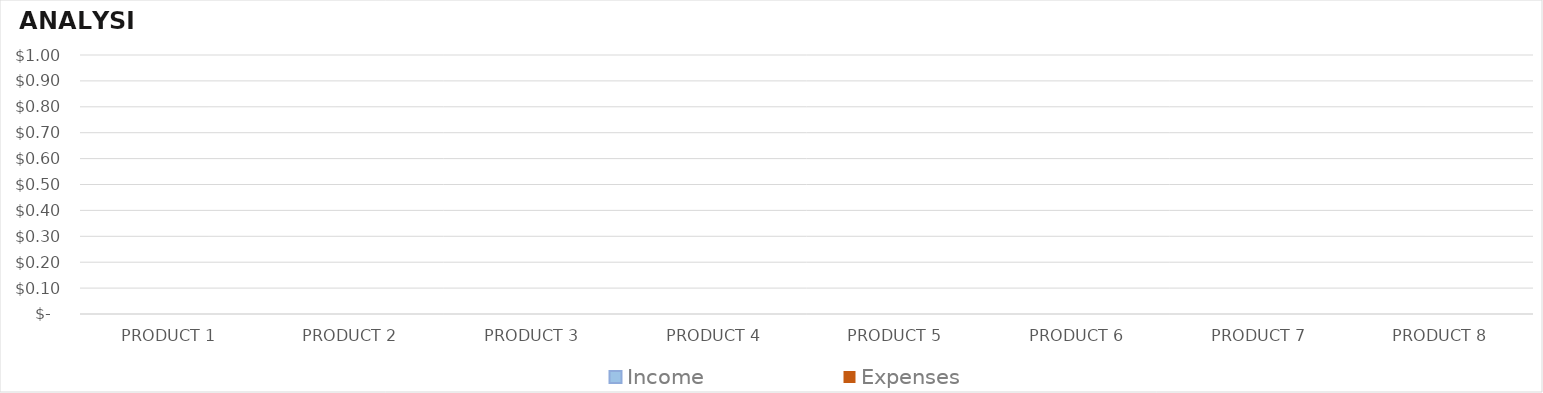
| Category | Income | Expenses |
|---|---|---|
| PRODUCT 1 | 0 | 0 |
| PRODUCT 2 | 0 | 0 |
| PRODUCT 3 | 0 | 0 |
| PRODUCT 4 | 0 | 0 |
| PRODUCT 5 | 0 | 0 |
| PRODUCT 6 | 0 | 0 |
| PRODUCT 7 | 0 | 0 |
| PRODUCT 8 | 0 | 0 |